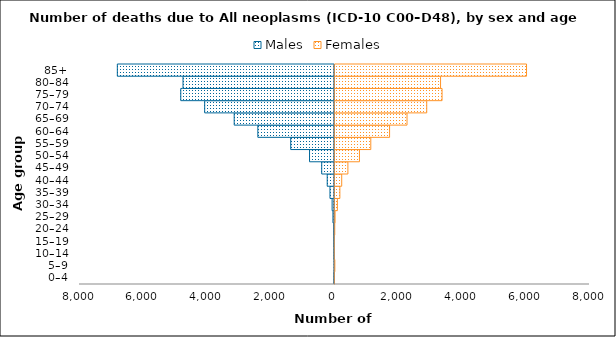
| Category | Males | Females |
|---|---|---|
| 0–4 | -17 | 14 |
| 5–9 | -14 | 26 |
| 10–14 | -17 | 9 |
| 15–19 | -25 | 9 |
| 20–24 | -27 | 24 |
| 25–29 | -49 | 34 |
| 30–34 | -75 | 106 |
| 35–39 | -142 | 184 |
| 40–44 | -228 | 242 |
| 45–49 | -401 | 436 |
| 50–54 | -783 | 799 |
| 55–59 | -1374 | 1154 |
| 60–64 | -2405 | 1744 |
| 65–69 | -3147 | 2291 |
| 70–74 | -4073 | 2909 |
| 75–79 | -4823 | 3390 |
| 80–84 | -4752 | 3343 |
| 85+ | -6813 | 6040 |